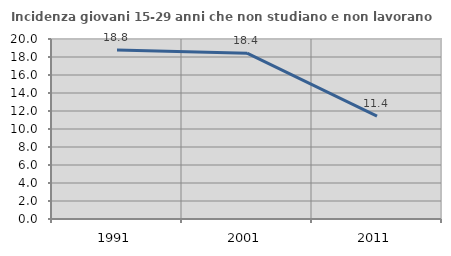
| Category | Incidenza giovani 15-29 anni che non studiano e non lavorano  |
|---|---|
| 1991.0 | 18.765 |
| 2001.0 | 18.421 |
| 2011.0 | 11.439 |